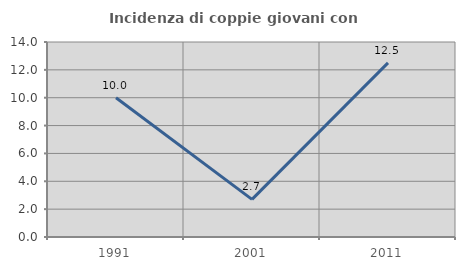
| Category | Incidenza di coppie giovani con figli |
|---|---|
| 1991.0 | 10 |
| 2001.0 | 2.703 |
| 2011.0 | 12.5 |